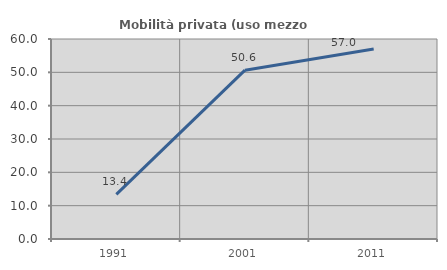
| Category | Mobilità privata (uso mezzo privato) |
|---|---|
| 1991.0 | 13.393 |
| 2001.0 | 50.649 |
| 2011.0 | 56.972 |